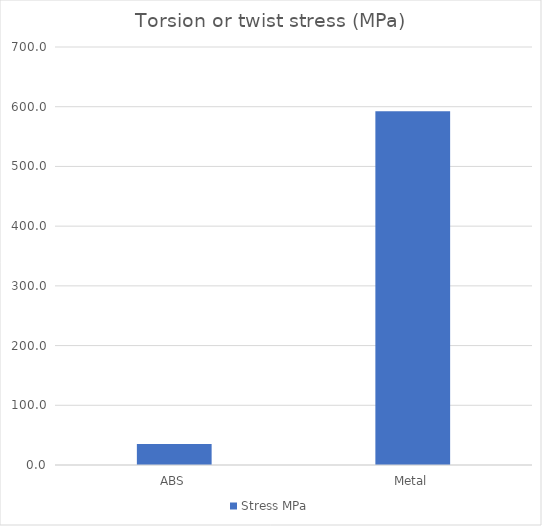
| Category | Stress MPa |
|---|---|
| ABS | 35.368 |
| Metal | 592.358 |